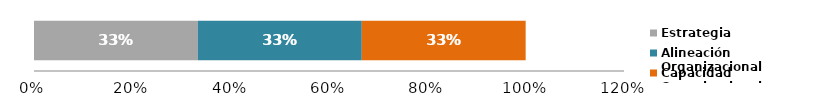
| Category | Estrategia | Alineación Organizacional | Capacidad Organizacional |
|---|---|---|---|
| 0 | 0.333 | 0.333 | 0.333 |